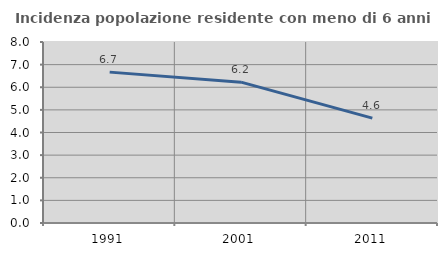
| Category | Incidenza popolazione residente con meno di 6 anni |
|---|---|
| 1991.0 | 6.668 |
| 2001.0 | 6.225 |
| 2011.0 | 4.637 |